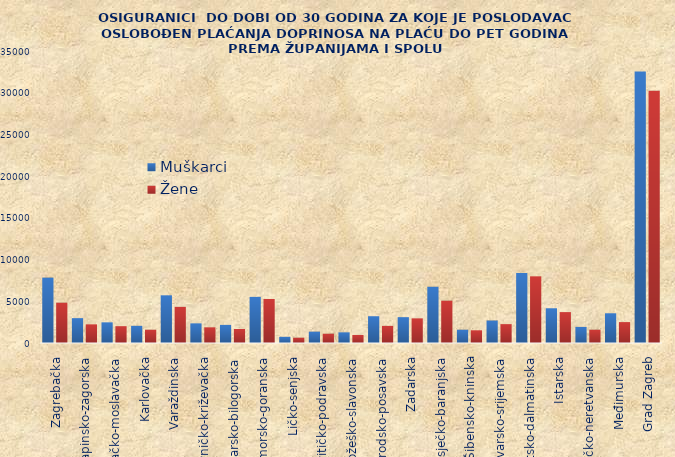
| Category | Muškarci | Žene |
|---|---|---|
| Zagrebačka | 7836 | 4834 |
| Krapinsko-zagorska | 2979 | 2236 |
| Sisačko-moslavačka | 2478 | 2017 |
| Karlovačka | 2059 | 1591 |
| Varaždinska | 5717 | 4332 |
| Koprivničko-križevačka | 2355 | 1878 |
| Bjelovarsko-bilogorska | 2171 | 1681 |
| Primorsko-goranska | 5530 | 5279 |
| Ličko-senjska | 742 | 636 |
| Virovitičko-podravska | 1363 | 1111 |
| Požeško-slavonska | 1278 | 963 |
| Brodsko-posavska | 3210 | 2050 |
| Zadarska | 3098 | 2954 |
| Osječko-baranjska | 6739 | 5073 |
| Šibensko-kninska | 1593 | 1523 |
| Vukovarsko-srijemska | 2694 | 2262 |
| Splitsko-dalmatinska | 8394 | 7991 |
| Istarska | 4164 | 3704 |
| Dubrovačko-neretvanska | 1930 | 1593 |
| Međimurska | 3564 | 2506 |
| Grad Zagreb | 32557 | 30243 |